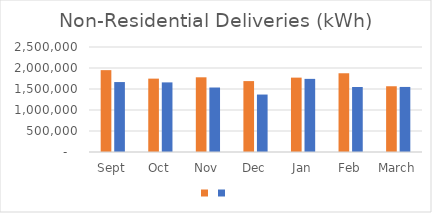
| Category | Series 1 | Series 0 |
|---|---|---|
| Sept | 1948950 | 1665239 |
| Oct | 1746850 | 1657467 |
| Nov | 1778480 | 1535448 |
| Dec | 1688051 | 1367905 |
| Jan | 1770828 | 1741151 |
| Feb | 1874770 | 1548063 |
| March | 1565360 | 1549153 |